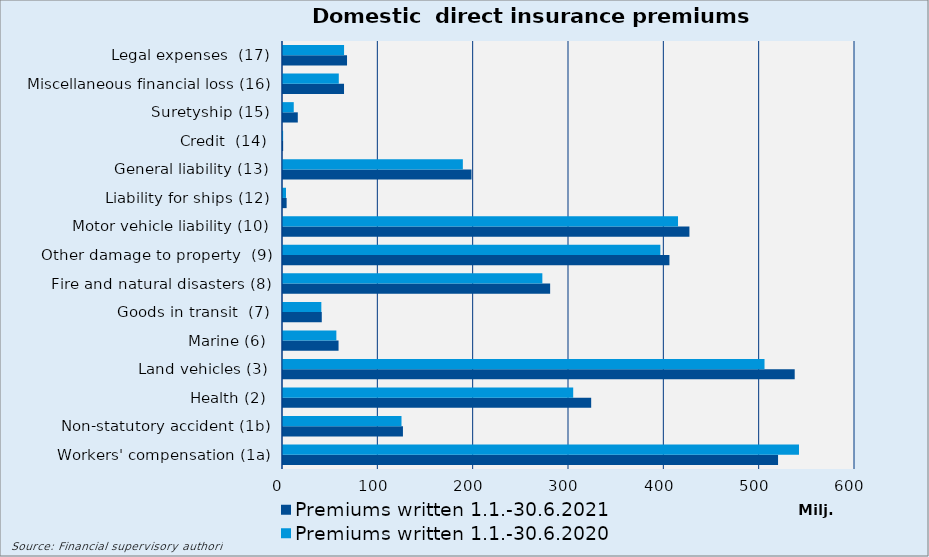
| Category | Premiums written |
|---|---|
| Workers' compensation (1a) | 541248.679 |
| Non-statutory accident (1b) | 124304.525 |
| Health (2) | 304411.718 |
| Land vehicles (3) | 505089.273 |
| Marine (6) | 55968.274 |
| Goods in transit  (7) | 40217.75 |
| Fire and natural disasters (8) | 272045.371 |
| Other damage to property  (9) | 395813.817 |
| Motor vehicle liability (10) | 414358.803 |
| Liability for ships (12) | 3126.74 |
| General liability (13) | 188654.525 |
| Credit  (14) | 130.491 |
| Suretyship (15) | 11280.655 |
| Miscellaneous financial loss (16) | 58524.778 |
| Legal expenses  (17) | 64048.359 |